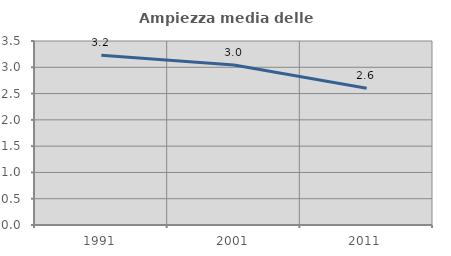
| Category | Ampiezza media delle famiglie |
|---|---|
| 1991.0 | 3.227 |
| 2001.0 | 3.045 |
| 2011.0 | 2.6 |